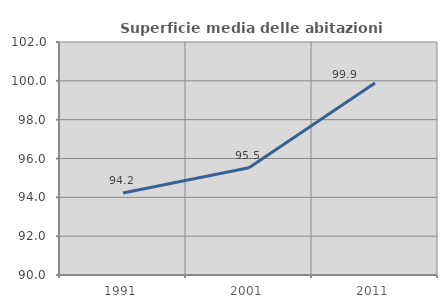
| Category | Superficie media delle abitazioni occupate |
|---|---|
| 1991.0 | 94.221 |
| 2001.0 | 95.526 |
| 2011.0 | 99.893 |